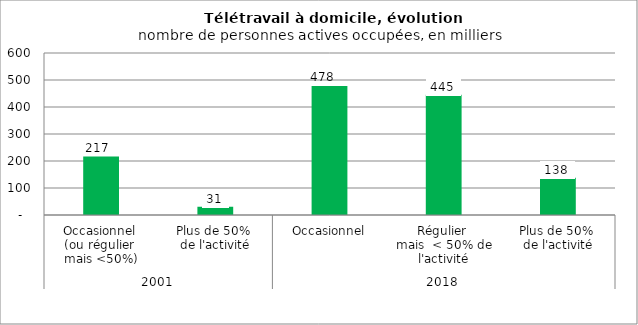
| Category | Télétravail à  domicile |
|---|---|
| 0 | 217 |
| 1 | 31 |
| 2 | 478 |
| 3 | 445 |
| 4 | 138 |